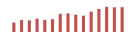
| Category | Importações (2) |
|---|---|
| 0 | 62681.056 |
| 1 | 79621.593 |
| 2 | 77709.867 |
| 3 | 88593.929 |
| 4 | 80744.22 |
| 5 | 85348.563 |
| 6 | 121368.935 |
| 7 | 124143.971 |
| 8 | 115571.707 |
| 9 | 109068.986 |
| 10 | 136178.726 |
| 11 | 153404.387 |
| 12 | 167744.463 |
| 13 | 164346.623 |
| 14 | 165333.113 |